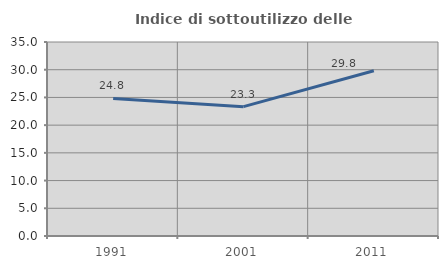
| Category | Indice di sottoutilizzo delle abitazioni  |
|---|---|
| 1991.0 | 24.828 |
| 2001.0 | 23.333 |
| 2011.0 | 29.814 |